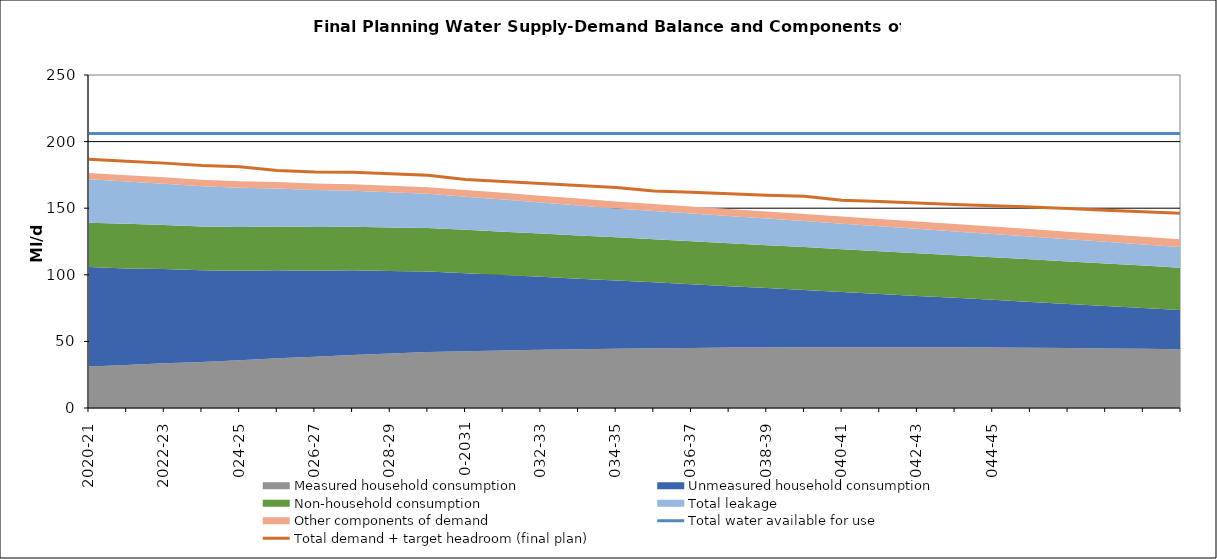
| Category | Total water available for use | Total demand + target headroom (final plan) |
|---|---|---|
| 2020-21 | 206.048 | 186.689 |
| 2021-22 | 206.048 | 185.309 |
| 2022-23 | 206.048 | 183.84 |
| 2023-24 | 206.048 | 182.019 |
| 2024-25 | 206.048 | 181.035 |
| 2025-26 | 206.048 | 178.282 |
| 2026-27 | 206.048 | 177.265 |
| 2027-28 | 206.048 | 176.939 |
| 2028-29 | 206.048 | 175.909 |
| 2029-30 | 206.048 | 174.813 |
| 2030-31 | 206.048 | 171.469 |
| 2031-32 | 206.048 | 170.044 |
| 2032-33 | 206.048 | 168.542 |
| 2033-34 | 206.048 | 167.016 |
| 2034-35 | 206.048 | 165.54 |
| 2035-36 | 206.048 | 162.972 |
| 2036-37 | 206.048 | 161.897 |
| 2037-38 | 206.048 | 160.847 |
| 2038-39 | 206.048 | 159.797 |
| 2039-40 | 206.048 | 158.894 |
| 2040-41 | 206.048 | 156.053 |
| 2041-42 | 206.048 | 155.033 |
| 2042-43 | 206.048 | 153.974 |
| 2043-44 | 206.048 | 152.852 |
| 2044-45 | 206.048 | 151.87 |
| 2045-46 | 206.048 | 150.813 |
| 2046-47 | 206.048 | 149.683 |
| 2047-48 | 206.048 | 148.474 |
| 2048-49 | 206.048 | 147.284 |
| 2049-50 | 206.048 | 146.124 |